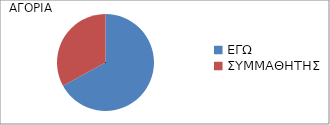
| Category | Series 0 |
|---|---|
| ΕΓΩ | 0.67 |
| ΣΥΜΜΑΘΗΤΗΣ | 0.33 |